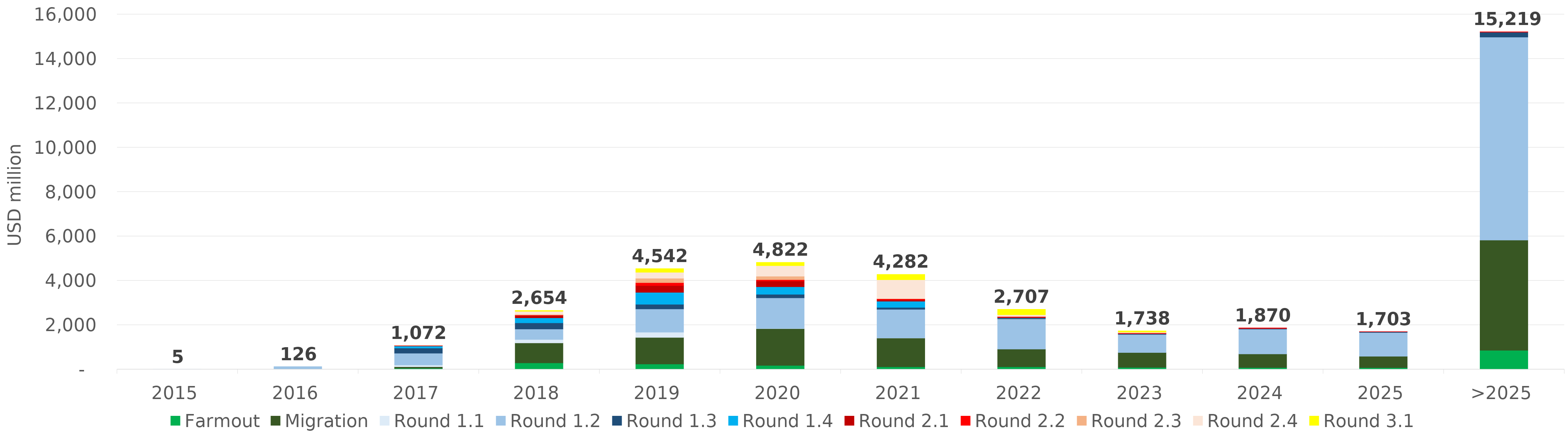
| Category | Farmout | Migration | Round 1.1 | Round 1.2 | Round 1.3 | Round 1.4 | Round 2.1 | Round 2.2 | Round 2.3 | Round 2.4 | Round 3.1 |
|---|---|---|---|---|---|---|---|---|---|---|---|
| 2015 | 0 | 0 | 4.573 | 0.236 | 0 | 0 | 0 | 0 | 0 | 0 | 0 |
| 2016 | 0 | 0 | 16.79 | 108.909 | 0 | 0 | 0 | 0 | 0 | 0 | 0 |
| 2017 | 50.877 | 65.422 | 76.429 | 533.486 | 231.789 | 93.443 | 18.851 | 1.29 | 0.72 | 0 | 0 |
| 2018 | 289.394 | 902.921 | 155.042 | 470.128 | 278.302 | 226.903 | 104.896 | 21.902 | 26.974 | 139.641 | 37.691 |
| 2019 | 241.207 | 1195.818 | 236.68 | 1049.68 | 207.126 | 540.649 | 302.09 | 133.009 | 199.161 | 270.262 | 166.186 |
| 2020 | 177.3 | 1656.852 | 6.736 | 1382.287 | 160.039 | 341.057 | 255.4 | 60.688 | 156.484 | 477.469 | 148.013 |
| 2021 | 111.804 | 1298.547 | 2.229 | 1293.069 | 88.66 | 274.593 | 68.406 | 44.429 | 10.051 | 847.746 | 242.801 |
| 2022 | 112.591 | 798.545 | 0 | 1363.556 | 40.604 | 10.69 | 23.744 | 30.043 | 0 | 82.428 | 244.664 |
| 2023 | 87.085 | 669.696 | 0 | 815.124 | 34.741 | 0.73 | 0 | 36.282 | 0 | 32.499 | 62.088 |
| 2024 | 79.455 | 613.256 | 0 | 1120.717 | 30.041 | 0 | 0 | 26.685 | 0 | 0 | 0 |
| 2025 | 75.288 | 512.631 | 0 | 1074.435 | 30.797 | 0 | 0 | 9.414 | 0 | 0 | 0 |
| >2025 | 859.226 | 4966.547 | 0 | 9146.402 | 225.326 | 0 | 0 | 21.146 | 0 | 0 | 0 |